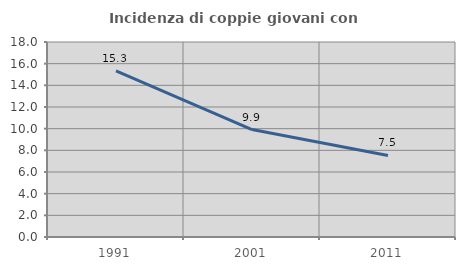
| Category | Incidenza di coppie giovani con figli |
|---|---|
| 1991.0 | 15.324 |
| 2001.0 | 9.921 |
| 2011.0 | 7.524 |